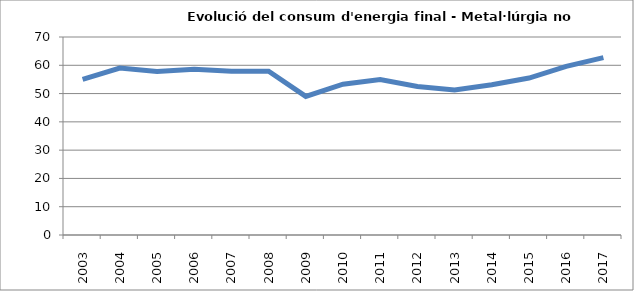
| Category | 55,0 59,0 57,8 58,6 57,9 57,9 49,0 53,3 55,0 52,5 51,3 53,1 55,5 59,6 62,7 |
|---|---|
| 2003.0 | 55 |
| 2004.0 | 59 |
| 2005.0 | 57.8 |
| 2006.0 | 58.6 |
| 2007.0 | 57.9 |
| 2008.0 | 57.9 |
| 2009.0 | 49 |
| 2010.0 | 53.3 |
| 2011.0 | 55 |
| 2012.0 | 52.5 |
| 2013.0 | 51.3 |
| 2014.0 | 53.1 |
| 2015.0 | 55.5 |
| 2016.0 | 59.6 |
| 2017.0 | 62.7 |